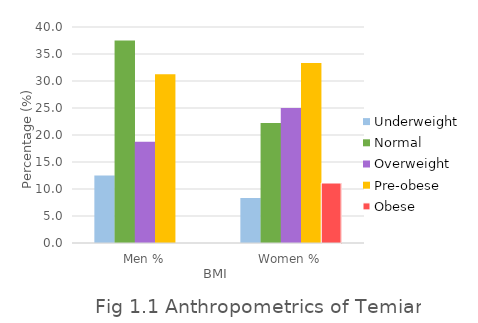
| Category | Underweight | Normal | Overweight | Pre-obese | Obese |
|---|---|---|---|---|---|
| Men % | 12.5 | 37.5 | 18.75 | 31.25 | 0 |
| Women % | 8.333 | 22.222 | 25 | 33.333 | 11.111 |